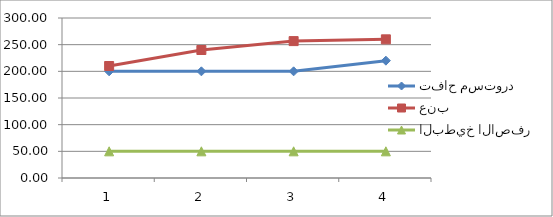
| Category | تفاح مستورد | عنب | البطيخ الاصفر |
|---|---|---|---|
| 0 | 200 | 210 | 50 |
| 1 | 200 | 240 | 50 |
| 2 | 200 | 256.67 | 50 |
| 3 | 220 | 260 | 50 |